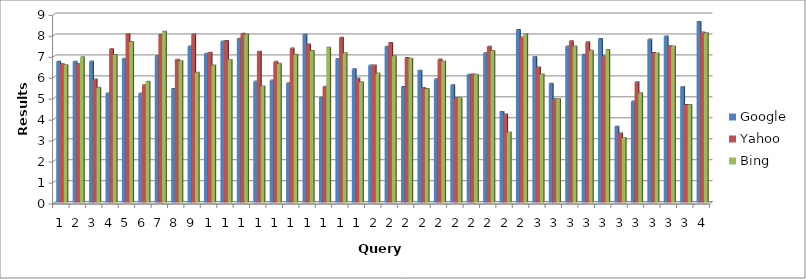
| Category | Google | Yahoo | Bing |
|---|---|---|---|
| 0 | 6.716 | 6.598 | 6.555 |
| 1 | 6.716 | 6.598 | 6.93 |
| 2 | 6.723 | 5.875 | 5.477 |
| 3 | 5.201 | 7.318 | 7.041 |
| 4 | 6.864 | 8.033 | 7.654 |
| 5 | 5.196 | 5.6 | 5.764 |
| 6 | 6.98 | 7.995 | 8.149 |
| 7 | 5.415 | 6.818 | 6.738 |
| 8 | 7.442 | 8.013 | 6.193 |
| 9 | 7.104 | 7.146 | 6.538 |
| 10 | 7.679 | 7.704 | 6.803 |
| 11 | 7.811 | 8.049 | 8.013 |
| 12 | 5.769 | 7.196 | 5.542 |
| 13 | 5.819 | 6.722 | 6.622 |
| 14 | 5.688 | 7.348 | 7.053 |
| 15 | 8.004 | 7.543 | 7.225 |
| 16 | 4.997 | 5.52 | 7.387 |
| 17 | 6.854 | 7.86 | 7.121 |
| 18 | 6.354 | 5.914 | 5.741 |
| 19 | 6.542 | 6.542 | 6.152 |
| 20 | 7.435 | 7.61 | 6.977 |
| 21 | 5.515 | 6.896 | 6.864 |
| 22 | 6.288 | 5.47 | 5.413 |
| 23 | 5.879 | 6.82 | 6.734 |
| 24 | 5.593 | 4.976 | 4.98 |
| 25 | 6.093 | 6.114 | 6.1 |
| 26 | 7.124 | 7.427 | 7.23 |
| 27 | 4.322 | 4.204 | 3.344 |
| 28 | 8.233 | 7.872 | 8.025 |
| 29 | 6.947 | 6.447 | 6.107 |
| 30 | 5.667 | 4.927 | 4.924 |
| 31 | 7.441 | 7.693 | 7.444 |
| 32 | 7.045 | 7.642 | 7.241 |
| 33 | 7.801 | 6.975 | 7.272 |
| 34 | 3.615 | 3.294 | 3.083 |
| 35 | 4.817 | 5.737 | 5.212 |
| 36 | 7.776 | 7.137 | 7.114 |
| 37 | 7.925 | 7.452 | 7.449 |
| 38 | 5.516 | 4.651 | 4.647 |
| 39 | 8.615 | 8.117 | 8.072 |